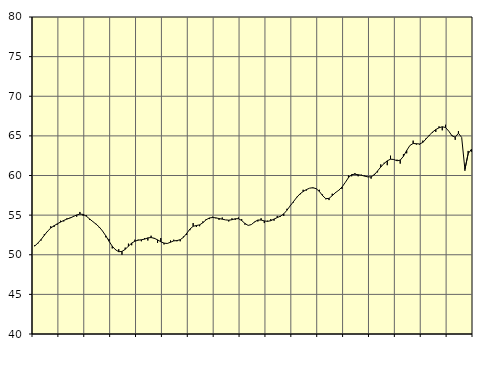
| Category | Piggar | Samtliga sysselsatta (inkl. sysselsatta utomlands) |
|---|---|---|
| nan | 51.2 | 51.09 |
| 87.0 | 51.4 | 51.47 |
| 87.0 | 51.8 | 51.93 |
| 87.0 | 52.6 | 52.45 |
| nan | 52.9 | 52.97 |
| 88.0 | 53.6 | 53.37 |
| 88.0 | 53.5 | 53.66 |
| 88.0 | 53.8 | 53.9 |
| nan | 54.3 | 54.12 |
| 89.0 | 54.2 | 54.33 |
| 89.0 | 54.6 | 54.5 |
| 89.0 | 54.7 | 54.64 |
| nan | 54.9 | 54.83 |
| 90.0 | 54.8 | 55.02 |
| 90.0 | 55.4 | 55.13 |
| 90.0 | 54.9 | 55.09 |
| nan | 55 | 54.86 |
| 91.0 | 54.4 | 54.52 |
| 91.0 | 54.2 | 54.18 |
| 91.0 | 53.9 | 53.86 |
| nan | 53.4 | 53.49 |
| 92.0 | 53 | 52.99 |
| 92.0 | 52.2 | 52.39 |
| 92.0 | 52 | 51.71 |
| nan | 50.8 | 51.08 |
| 93.0 | 50.7 | 50.63 |
| 93.0 | 50.7 | 50.38 |
| 93.0 | 50 | 50.42 |
| nan | 50.9 | 50.68 |
| 94.0 | 51.4 | 51.09 |
| 94.0 | 51.2 | 51.47 |
| 94.0 | 51.9 | 51.71 |
| nan | 51.9 | 51.84 |
| 95.0 | 51.7 | 51.89 |
| 95.0 | 52.1 | 51.97 |
| 95.0 | 51.8 | 52.13 |
| nan | 52.4 | 52.17 |
| 96.0 | 52 | 52.08 |
| 96.0 | 51.5 | 51.88 |
| 96.0 | 52.1 | 51.64 |
| nan | 51.3 | 51.47 |
| 97.0 | 51.4 | 51.42 |
| 97.0 | 51.8 | 51.58 |
| 97.0 | 51.9 | 51.75 |
| nan | 51.7 | 51.79 |
| 98.0 | 51.7 | 51.9 |
| 98.0 | 52.3 | 52.2 |
| 98.0 | 52.5 | 52.69 |
| nan | 53.1 | 53.24 |
| 99.0 | 54 | 53.59 |
| 99.0 | 53.5 | 53.69 |
| 99.0 | 53.6 | 53.77 |
| nan | 54.2 | 54.04 |
| 0.0 | 54.5 | 54.41 |
| 0.0 | 54.5 | 54.64 |
| 0.0 | 54.8 | 54.7 |
| nan | 54.6 | 54.66 |
| 1.0 | 54.4 | 54.57 |
| 1.0 | 54.7 | 54.49 |
| 1.0 | 54.4 | 54.4 |
| nan | 54.2 | 54.36 |
| 2.0 | 54.6 | 54.42 |
| 2.0 | 54.4 | 54.54 |
| 2.0 | 54.7 | 54.55 |
| nan | 54.5 | 54.32 |
| 3.0 | 53.8 | 53.95 |
| 3.0 | 53.7 | 53.7 |
| 3.0 | 53.8 | 53.81 |
| nan | 54.1 | 54.15 |
| 4.0 | 54.2 | 54.38 |
| 4.0 | 54.6 | 54.38 |
| 4.0 | 54 | 54.27 |
| nan | 54.3 | 54.21 |
| 5.0 | 54.5 | 54.3 |
| 5.0 | 54.3 | 54.5 |
| 5.0 | 54.9 | 54.69 |
| nan | 54.8 | 54.87 |
| 6.0 | 54.9 | 55.16 |
| 6.0 | 55.8 | 55.62 |
| 6.0 | 56.2 | 56.17 |
| nan | 56.6 | 56.7 |
| 7.0 | 57.3 | 57.23 |
| 7.0 | 57.6 | 57.67 |
| 7.0 | 58.2 | 57.98 |
| nan | 58.1 | 58.22 |
| 8.0 | 58.4 | 58.4 |
| 8.0 | 58.4 | 58.46 |
| 8.0 | 58.3 | 58.34 |
| nan | 58.2 | 58 |
| 9.0 | 57.6 | 57.46 |
| 9.0 | 57 | 57.08 |
| 9.0 | 56.9 | 57.11 |
| nan | 57.7 | 57.46 |
| 10.0 | 57.9 | 57.84 |
| 10.0 | 58.1 | 58.14 |
| 10.0 | 58.3 | 58.54 |
| nan | 59.1 | 59.11 |
| 11.0 | 60 | 59.73 |
| 11.0 | 59.9 | 60.11 |
| 11.0 | 60.3 | 60.16 |
| nan | 59.9 | 60.1 |
| 12.0 | 60.1 | 60.03 |
| 12.0 | 60 | 59.92 |
| 12.0 | 59.8 | 59.83 |
| nan | 59.6 | 59.83 |
| 13.0 | 60.2 | 60.09 |
| 13.0 | 60.4 | 60.57 |
| 13.0 | 61.4 | 61.07 |
| nan | 61.6 | 61.51 |
| 14.0 | 61.3 | 61.85 |
| 14.0 | 62.5 | 62.06 |
| 14.0 | 62 | 62.02 |
| nan | 62 | 61.86 |
| 15.0 | 61.5 | 61.94 |
| 15.0 | 62.7 | 62.42 |
| 15.0 | 62.8 | 63.15 |
| nan | 63.8 | 63.79 |
| 16.0 | 64.4 | 64.04 |
| 16.0 | 63.9 | 64.01 |
| 16.0 | 63.9 | 63.98 |
| nan | 64.4 | 64.17 |
| 17.0 | 64.7 | 64.62 |
| 17.0 | 65 | 65.08 |
| 17.0 | 65.4 | 65.48 |
| nan | 65.5 | 65.8 |
| 18.0 | 66.2 | 66.02 |
| 18.0 | 65.7 | 66.15 |
| 18.0 | 66.4 | 66.06 |
| nan | 65.6 | 65.6 |
| 19.0 | 65.1 | 65.01 |
| 19.0 | 64.5 | 64.84 |
| 19.0 | 65.6 | 65.33 |
| nan | 64.8 | 64.8 |
| 20.0 | 60.6 | 60.76 |
| 20.0 | 63.1 | 62.76 |
| 20.0 | 63 | 63.3 |